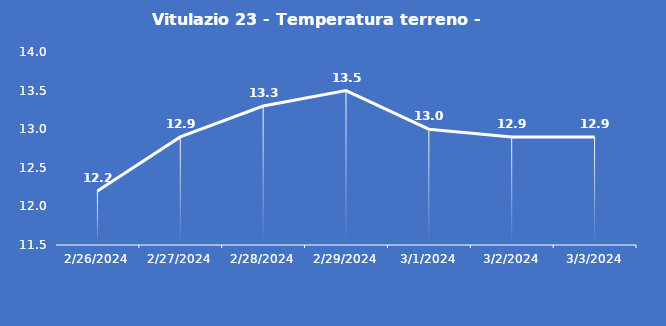
| Category | Vitulazio 23 - Temperatura terreno - Grezzo (°C) |
|---|---|
| 2/26/24 | 12.2 |
| 2/27/24 | 12.9 |
| 2/28/24 | 13.3 |
| 2/29/24 | 13.5 |
| 3/1/24 | 13 |
| 3/2/24 | 12.9 |
| 3/3/24 | 12.9 |